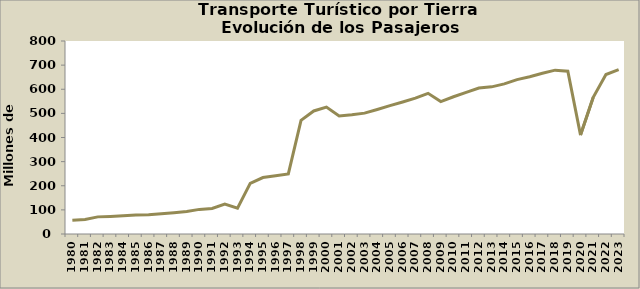
| Category | Series 0 |
|---|---|
| 1980.0 | 57 |
| 1981.0 | 60 |
| 1982.0 | 71 |
| 1983.0 | 73 |
| 1984.0 | 76 |
| 1985.0 | 79 |
| 1986.0 | 80 |
| 1987.0 | 84 |
| 1988.0 | 88 |
| 1989.0 | 93 |
| 1990.0 | 102 |
| 1991.0 | 106 |
| 1992.0 | 124 |
| 1993.0 | 107 |
| 1994.0 | 210 |
| 1995.0 | 234 |
| 1996.0 | 241 |
| 1997.0 | 249 |
| 1998.0 | 471 |
| 1999.0 | 510 |
| 2000.0 | 526 |
| 2001.0 | 489 |
| 2002.0 | 494 |
| 2003.0 | 501 |
| 2004.0 | 516 |
| 2005.0 | 532 |
| 2006.0 | 547 |
| 2007.0 | 563 |
| 2008.0 | 583 |
| 2009.0 | 549 |
| 2010.0 | 569 |
| 2011.0 | 587 |
| 2012.0 | 605 |
| 2013.0 | 610 |
| 2014.0 | 622.205 |
| 2015.0 | 640 |
| 2016.0 | 652.14 |
| 2017.0 | 666.18 |
| 2018.0 | 679.14 |
| 2019.0 | 674.82 |
| 2020.0 | 410 |
| 2021.0 | 566.46 |
| 2022.0 | 661 |
| 2023.0 | 681 |